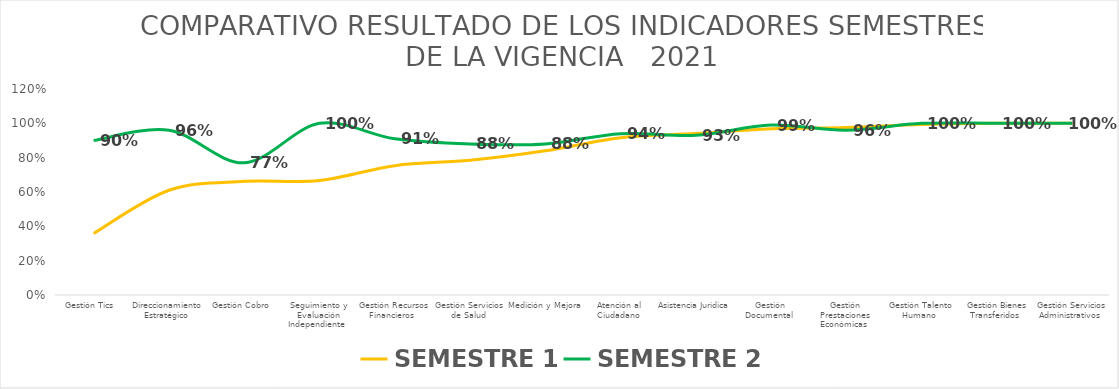
| Category | SEMESTRE 1 | SEMESTRE 2 |
|---|---|---|
| Gestión Tics  | 0.359 | 0.9 |
| Direccionamiento Estratégico  | 0.61 | 0.96 |
| Gestión Cobro  | 0.662 | 0.77 |
| Seguimiento y Evaluación Independiente  | 0.667 | 1 |
| Gestión Recursos Financieros  | 0.753 | 0.91 |
| Gestión Servicios de Salud  | 0.785 | 0.88 |
| Medición y Mejora | 0.84 | 0.88 |
| Atención al Ciudadano  | 0.916 | 0.94 |
| Asistencia Jurídica  | 0.94 | 0.93 |
| Gestión Documental  | 0.968 | 0.99 |
| Gestión Prestaciones Económicas  | 0.976 | 0.96 |
| Gestión Talento Humano  | 0.993 | 1 |
| Gestión Bienes Transferidos  | 1 | 1 |
| Gestión Servicios Administrativos  | 1 | 1 |